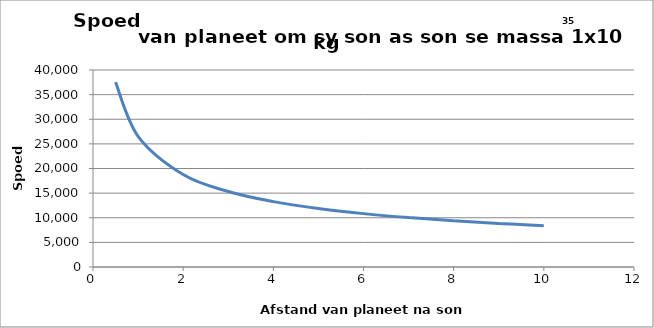
| Category | v (m/s) |
|---|---|
| 0.5 | 37537.496 |
| 1.0 | 26543.018 |
| 2.0 | 18768.748 |
| 3.0 | 15324.619 |
| 4.0 | 13271.509 |
| 5.0 | 11870.399 |
| 6.0 | 10836.142 |
| 7.0 | 10032.318 |
| 8.0 | 9384.374 |
| 9.0 | 8847.673 |
| 10.0 | 8393.639 |